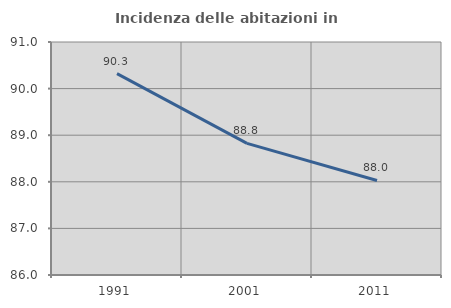
| Category | Incidenza delle abitazioni in proprietà  |
|---|---|
| 1991.0 | 90.323 |
| 2001.0 | 88.824 |
| 2011.0 | 88.028 |